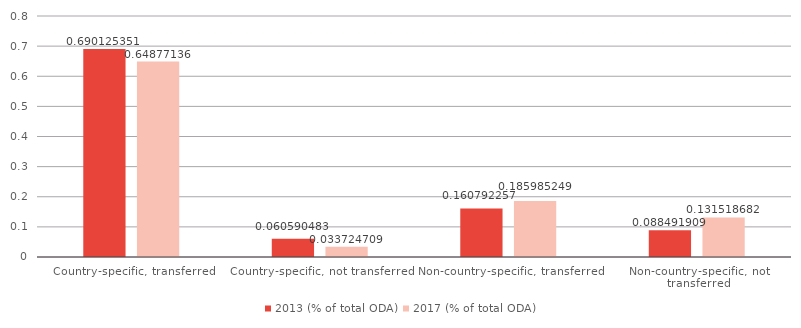
| Category | 2013 (% of total ODA) | 2017 (% of total ODA) |
|---|---|---|
| Country-specific, transferred | 0.69 | 0.649 |
| Country-specific, not transferred | 0.061 | 0.034 |
| Non-country-specific, transferred | 0.161 | 0.186 |
| Non-country-specific, not transferred | 0.088 | 0.132 |